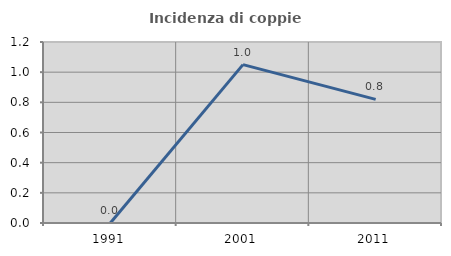
| Category | Incidenza di coppie miste |
|---|---|
| 1991.0 | 0 |
| 2001.0 | 1.05 |
| 2011.0 | 0.82 |